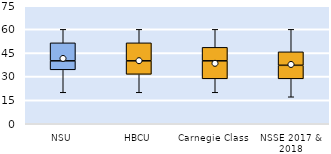
| Category | 25th | 50th | 75th |
|---|---|---|---|
| NSU | 34.286 | 5.714 | 11.429 |
| HBCU | 31.429 | 8.571 | 11.429 |
| Carnegie Class | 28.571 | 11.429 | 8.571 |
| NSSE 2017 & 2018 | 28.571 | 8.571 | 8.571 |